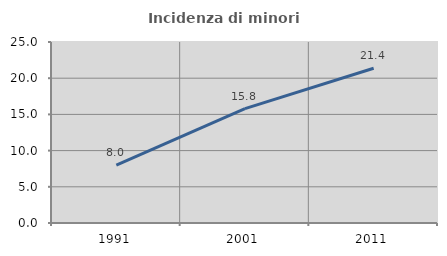
| Category | Incidenza di minori stranieri |
|---|---|
| 1991.0 | 8 |
| 2001.0 | 15.789 |
| 2011.0 | 21.379 |